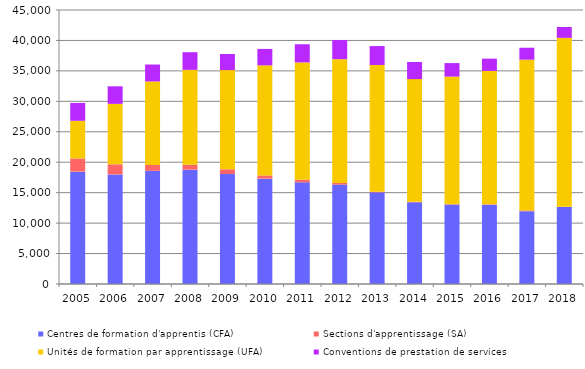
| Category | Centres de formation d'apprentis (CFA) | Sections d'apprentissage (SA) | Unités de formation par apprentissage (UFA) | Conventions de prestation de services |
|---|---|---|---|---|
| 2005.0 | 18455 | 2161 | 6188 | 2936 |
| 2006.0 | 17995 | 1665 | 9928 | 2880 |
| 2007.0 | 18591 | 970 | 13702 | 2782 |
| 2008.0 | 18779 | 805 | 15585 | 2902 |
| 2009.0 | 18062 | 782 | 16283 | 2645 |
| 2010.0 | 17304 | 526 | 18083 | 2695 |
| 2011.0 | 16694 | 439 | 19253 | 2985 |
| 2012.0 | 16323 | 276 | 20323 | 3150 |
| 2013.0 | 15050 | 108 | 20814 | 3103 |
| 2014.0 | 13425 | 78 | 20145 | 2814 |
| 2015.0 | 13046 | 47 | 20970 | 2216 |
| 2016.0 | 13022 | 75 | 21904 | 2009 |
| 2017.0 | 11961 | 129 | 24749 | 1964 |
| 2018.0 | 12653 | 22 | 27752 | 1782 |